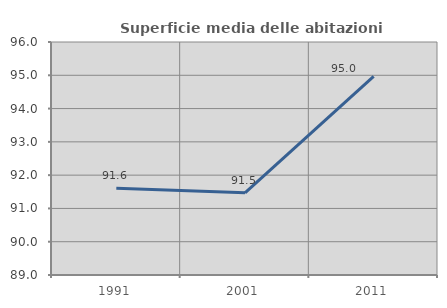
| Category | Superficie media delle abitazioni occupate |
|---|---|
| 1991.0 | 91.608 |
| 2001.0 | 91.469 |
| 2011.0 | 94.969 |